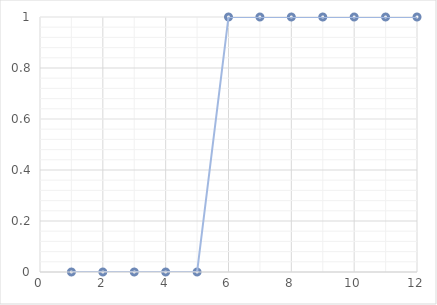
| Category | Series 0 |
|---|---|
| 1.0 | 0 |
| 2.0 | 0 |
| 3.0 | 0 |
| 4.0 | 0 |
| 5.0 | 0 |
| 6.0 | 1 |
| 7.0 | 1 |
| 8.0 | 1 |
| 9.0 | 1 |
| 10.0 | 1 |
| 11.0 | 1 |
| 12.0 | 1 |